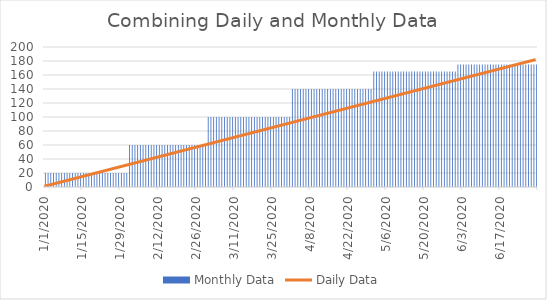
| Category | Monthly Data |
|---|---|
| 1/1/20 | 20 |
| 1/2/20 | 20 |
| 1/3/20 | 20 |
| 1/4/20 | 20 |
| 1/5/20 | 20 |
| 1/6/20 | 20 |
| 1/7/20 | 20 |
| 1/8/20 | 20 |
| 1/9/20 | 20 |
| 1/10/20 | 20 |
| 1/11/20 | 20 |
| 1/12/20 | 20 |
| 1/13/20 | 20 |
| 1/14/20 | 20 |
| 1/15/20 | 20 |
| 1/16/20 | 20 |
| 1/17/20 | 20 |
| 1/18/20 | 20 |
| 1/19/20 | 20 |
| 1/20/20 | 20 |
| 1/21/20 | 20 |
| 1/22/20 | 20 |
| 1/23/20 | 20 |
| 1/24/20 | 20 |
| 1/25/20 | 20 |
| 1/26/20 | 20 |
| 1/27/20 | 20 |
| 1/28/20 | 20 |
| 1/29/20 | 20 |
| 1/30/20 | 20 |
| 1/31/20 | 20 |
| 2/1/20 | 60 |
| 2/2/20 | 60 |
| 2/3/20 | 60 |
| 2/4/20 | 60 |
| 2/5/20 | 60 |
| 2/6/20 | 60 |
| 2/7/20 | 60 |
| 2/8/20 | 60 |
| 2/9/20 | 60 |
| 2/10/20 | 60 |
| 2/11/20 | 60 |
| 2/12/20 | 60 |
| 2/13/20 | 60 |
| 2/14/20 | 60 |
| 2/15/20 | 60 |
| 2/16/20 | 60 |
| 2/17/20 | 60 |
| 2/18/20 | 60 |
| 2/19/20 | 60 |
| 2/20/20 | 60 |
| 2/21/20 | 60 |
| 2/22/20 | 60 |
| 2/23/20 | 60 |
| 2/24/20 | 60 |
| 2/25/20 | 60 |
| 2/26/20 | 60 |
| 2/27/20 | 60 |
| 2/28/20 | 60 |
| 2/29/20 | 60 |
| 3/1/20 | 100 |
| 3/2/20 | 100 |
| 3/3/20 | 100 |
| 3/4/20 | 100 |
| 3/5/20 | 100 |
| 3/6/20 | 100 |
| 3/7/20 | 100 |
| 3/8/20 | 100 |
| 3/9/20 | 100 |
| 3/10/20 | 100 |
| 3/11/20 | 100 |
| 3/12/20 | 100 |
| 3/13/20 | 100 |
| 3/14/20 | 100 |
| 3/15/20 | 100 |
| 3/16/20 | 100 |
| 3/17/20 | 100 |
| 3/18/20 | 100 |
| 3/19/20 | 100 |
| 3/20/20 | 100 |
| 3/21/20 | 100 |
| 3/22/20 | 100 |
| 3/23/20 | 100 |
| 3/24/20 | 100 |
| 3/25/20 | 100 |
| 3/26/20 | 100 |
| 3/27/20 | 100 |
| 3/28/20 | 100 |
| 3/29/20 | 100 |
| 3/30/20 | 100 |
| 3/31/20 | 100 |
| 4/1/20 | 140 |
| 4/2/20 | 140 |
| 4/3/20 | 140 |
| 4/4/20 | 140 |
| 4/5/20 | 140 |
| 4/6/20 | 140 |
| 4/7/20 | 140 |
| 4/8/20 | 140 |
| 4/9/20 | 140 |
| 4/10/20 | 140 |
| 4/11/20 | 140 |
| 4/12/20 | 140 |
| 4/13/20 | 140 |
| 4/14/20 | 140 |
| 4/15/20 | 140 |
| 4/16/20 | 140 |
| 4/17/20 | 140 |
| 4/18/20 | 140 |
| 4/19/20 | 140 |
| 4/20/20 | 140 |
| 4/21/20 | 140 |
| 4/22/20 | 140 |
| 4/23/20 | 140 |
| 4/24/20 | 140 |
| 4/25/20 | 140 |
| 4/26/20 | 140 |
| 4/27/20 | 140 |
| 4/28/20 | 140 |
| 4/29/20 | 140 |
| 4/30/20 | 140 |
| 5/1/20 | 165 |
| 5/2/20 | 165 |
| 5/3/20 | 165 |
| 5/4/20 | 165 |
| 5/5/20 | 165 |
| 5/6/20 | 165 |
| 5/7/20 | 165 |
| 5/8/20 | 165 |
| 5/9/20 | 165 |
| 5/10/20 | 165 |
| 5/11/20 | 165 |
| 5/12/20 | 165 |
| 5/13/20 | 165 |
| 5/14/20 | 165 |
| 5/15/20 | 165 |
| 5/16/20 | 165 |
| 5/17/20 | 165 |
| 5/18/20 | 165 |
| 5/19/20 | 165 |
| 5/20/20 | 165 |
| 5/21/20 | 165 |
| 5/22/20 | 165 |
| 5/23/20 | 165 |
| 5/24/20 | 165 |
| 5/25/20 | 165 |
| 5/26/20 | 165 |
| 5/27/20 | 165 |
| 5/28/20 | 165 |
| 5/29/20 | 165 |
| 5/30/20 | 165 |
| 5/31/20 | 165 |
| 6/1/20 | 175 |
| 6/2/20 | 175 |
| 6/3/20 | 175 |
| 6/4/20 | 175 |
| 6/5/20 | 175 |
| 6/6/20 | 175 |
| 6/7/20 | 175 |
| 6/8/20 | 175 |
| 6/9/20 | 175 |
| 6/10/20 | 175 |
| 6/11/20 | 175 |
| 6/12/20 | 175 |
| 6/13/20 | 175 |
| 6/14/20 | 175 |
| 6/15/20 | 175 |
| 6/16/20 | 175 |
| 6/17/20 | 175 |
| 6/18/20 | 175 |
| 6/19/20 | 175 |
| 6/20/20 | 175 |
| 6/21/20 | 175 |
| 6/22/20 | 175 |
| 6/23/20 | 175 |
| 6/24/20 | 175 |
| 6/25/20 | 175 |
| 6/26/20 | 175 |
| 6/27/20 | 175 |
| 6/28/20 | 175 |
| 6/29/20 | 175 |
| 6/30/20 | 175 |